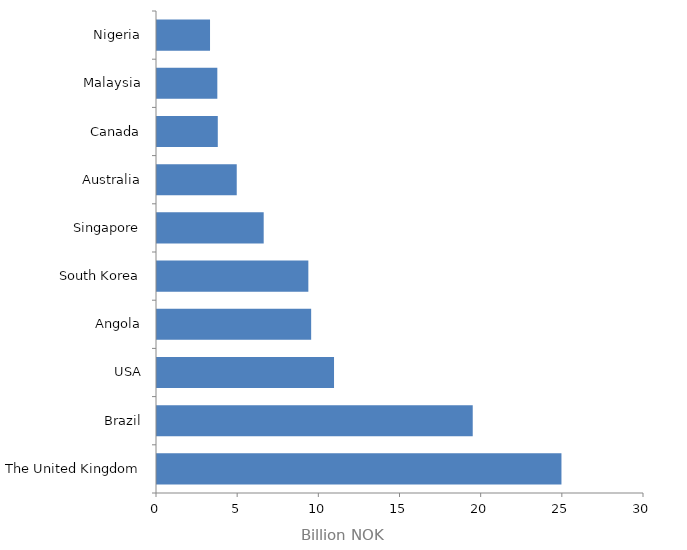
| Category | Revenue |
|---|---|
| The United Kingdom | 24.915 |
| Brazil | 19.449 |
| USA | 10.905 |
| Angola | 9.496 |
| South Korea | 9.323 |
| Singapore | 6.572 |
| Australia | 4.912 |
| Canada | 3.745 |
| Malaysia | 3.716 |
| Nigeria | 3.267 |